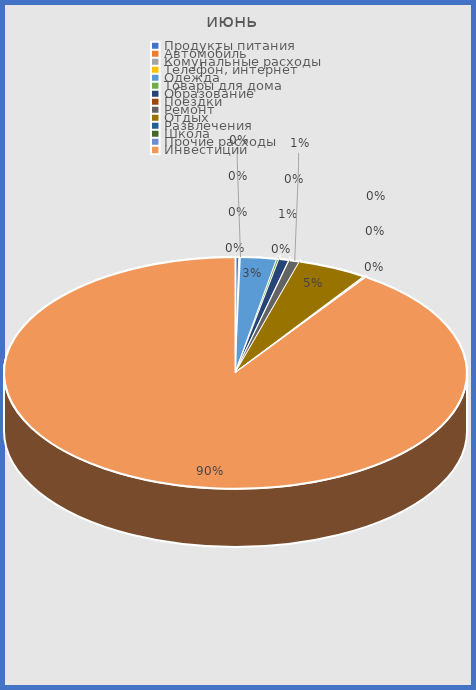
| Category | Series 0 |
|---|---|
| Продукты питания | 0.003 |
| Автомобиль | 0.001 |
| Комунальные расходы | 0 |
| Телефон, интернет | 0 |
| Одежда | 0.025 |
| Товары для дома | 0.002 |
| Образование | 0.007 |
| Поездки | 0 |
| Ремонт | 0.007 |
| Отдых | 0.049 |
| Развлечения | 0.001 |
| Школа | 0.001 |
| Прочие расходы | 0.001 |
| Инвестиции | 0.904 |